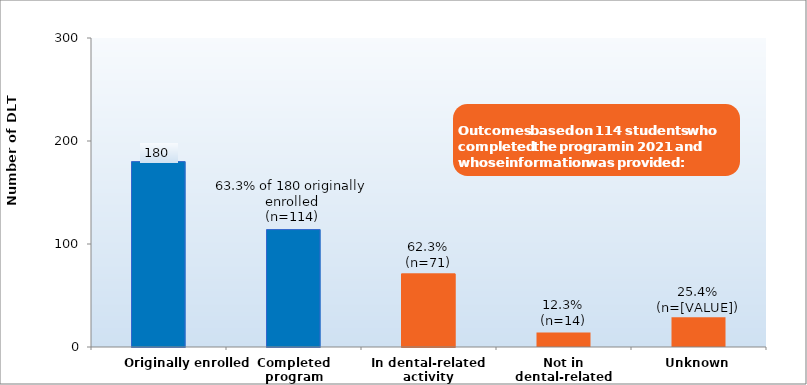
| Category | Series 0 |
|---|---|
| Originally enrolled | 180 |
| Completed program | 114 |
| In dental-related activity | 71 |
| Not in dental-related activity | 14 |
| Unknown | 29 |